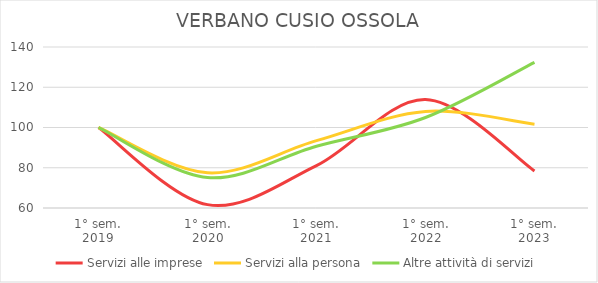
| Category | Servizi alle imprese | Servizi alla persona | Altre attività di servizi |
|---|---|---|---|
| 1° sem.
2019 | 100 | 100 | 100 |
| 1° sem.
2020 | 61.672 | 77.488 | 75.128 |
| 1° sem.
2021 | 81.073 | 93.454 | 90.689 |
| 1° sem.
2022 | 113.88 | 107.961 | 104.974 |
| 1° sem.
2023 | 78.391 | 101.636 | 132.398 |